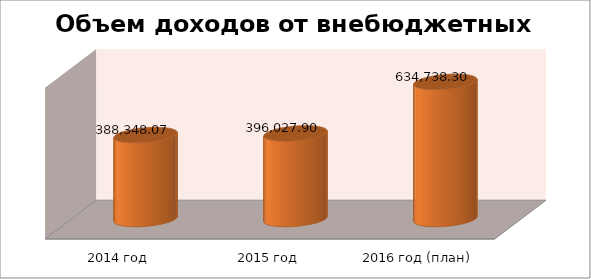
| Category | Series 0 |
|---|---|
| 2014 год | 388348.07 |
| 2015 год | 396027.9 |
| 2016 год (план) | 634738.3 |